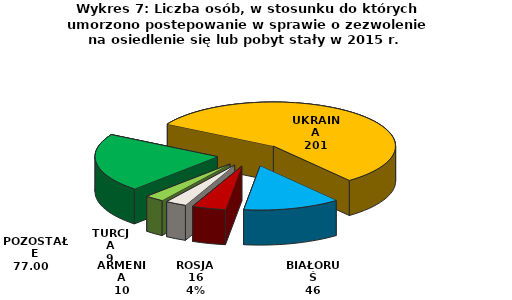
| Category | Series 0 |
|---|---|
| UKRAINA | 201 |
| BIAŁORUŚ | 46 |
| ROSJA | 16 |
| ARMENIA | 10 |
| TURCJA | 9 |
| POZOSTAŁE | 77 |